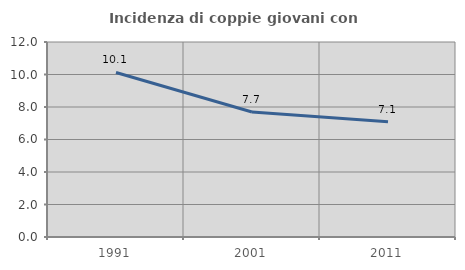
| Category | Incidenza di coppie giovani con figli |
|---|---|
| 1991.0 | 10.124 |
| 2001.0 | 7.692 |
| 2011.0 | 7.099 |